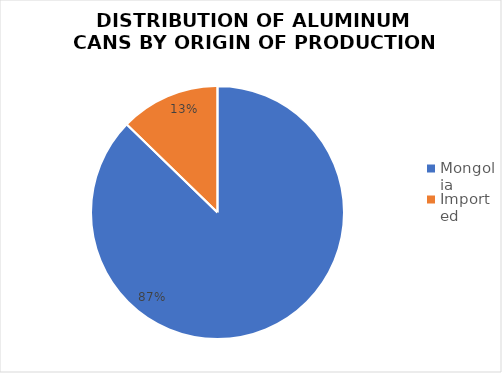
| Category | Series 0 |
|---|---|
| Mongolia | 1288 |
| Imported | 188 |